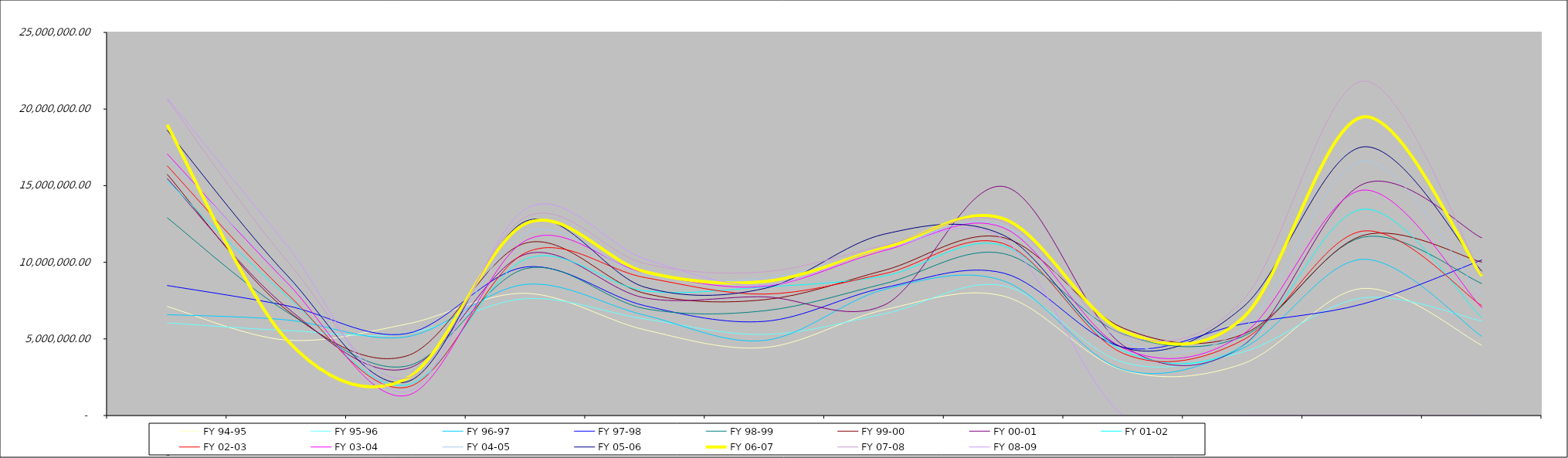
| Category |  FY 94-95  |  FY 95-96  |  FY 96-97  |  FY 97-98  |  FY 98-99  |  FY 99-00  |  FY 00-01  |  FY 01-02  | FY 02-03 | FY 03-04 | FY 04-05 | FY 05-06 | FY 06-07 | FY 07-08 | FY 08-09 |
|---|---|---|---|---|---|---|---|---|---|---|---|---|---|---|---|
| FY 08-09 | 7115499.93 | 6044999.94 | 6582000.12 | 8487999.99 | 12911999.92 | 15744999.95 | 15476000.01 | 15331000 | 16301900.14 | 17081000 | 16846999.93 | 18623455.09 | 18980999.99 | 20625173.95 | 20720263.78 |